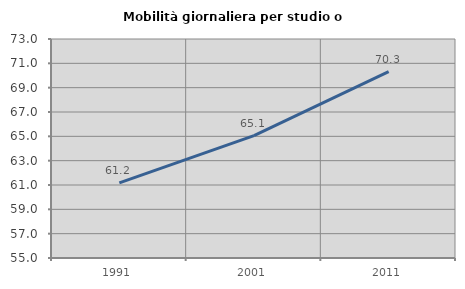
| Category | Mobilità giornaliera per studio o lavoro |
|---|---|
| 1991.0 | 61.18 |
| 2001.0 | 65.059 |
| 2011.0 | 70.31 |